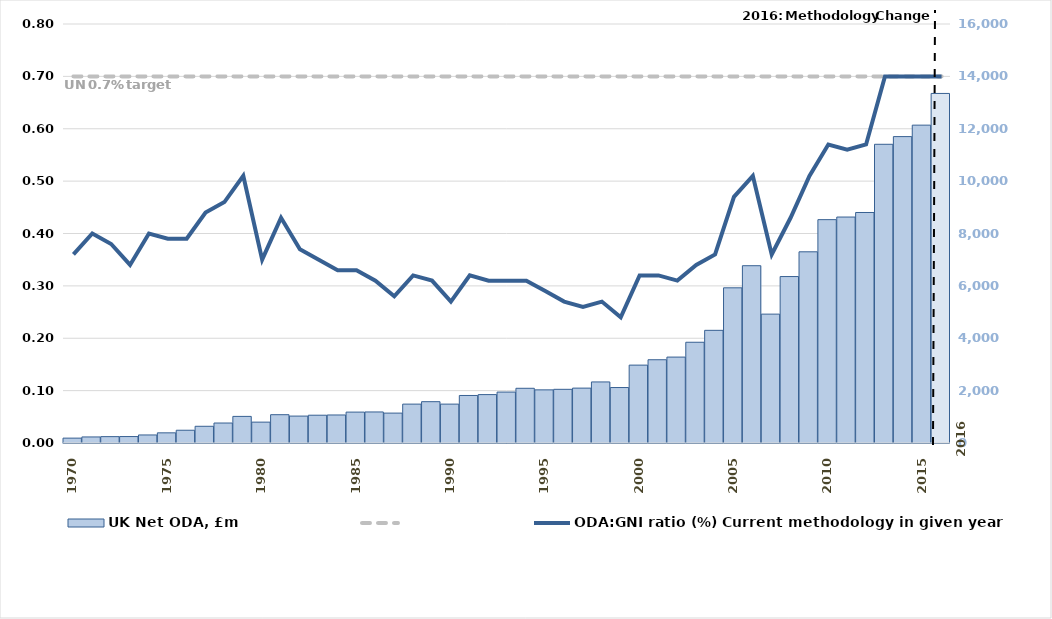
| Category | UK Net ODA, £m |
|---|---|
| 1970.0 | 186 |
| 1971.0 | 231 |
| 1972.0 | 243 |
| 1973.0 | 246 |
| 1974.0 | 307 |
| 1975.0 | 388 |
| 1976.0 | 487 |
| 1977.0 | 638 |
| 1978.0 | 763 |
| 1979.0 | 1016 |
| 1980.0 | 797 |
| 1981.0 | 1081 |
| 1982.0 | 1028 |
| 1983.0 | 1061 |
| 1984.0 | 1070 |
| 1985.0 | 1180 |
| 1986.0 | 1185 |
| 1987.0 | 1142 |
| 1988.0 | 1485 |
| 1989.0 | 1578 |
| 1990.0 | 1485 |
| 1991.0 | 1815 |
| 1992.0 | 1848 |
| 1993.0 | 1945 |
| 1994.0 | 2089 |
| 1995.0 | 2029 |
| 1996.0 | 2050 |
| 1997.0 | 2096 |
| 1998.0 | 2332 |
| 1999.0 | 2118 |
| 2000.0 | 2974 |
| 2001.0 | 3179 |
| 2002.0 | 3281 |
| 2003.0 | 3847 |
| 2004.0 | 4302 |
| 2005.0 | 5926 |
| 2006.0 | 6770 |
| 2007.0 | 4921 |
| 2008.0 | 6356 |
| 2009.0 | 7301 |
| 2010.0 | 8528.781 |
| 2011.0 | 8628.623 |
| 2012.0 | 8801.919 |
| 2013.0 | 11406.86 |
| 2014.0 | 11700.472 |
| 2015.0 | 12137.609 |
| 2016.0 | 13347.97 |